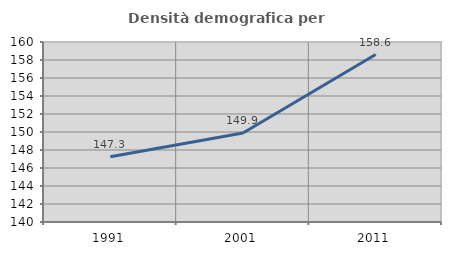
| Category | Densità demografica |
|---|---|
| 1991.0 | 147.251 |
| 2001.0 | 149.883 |
| 2011.0 | 158.604 |